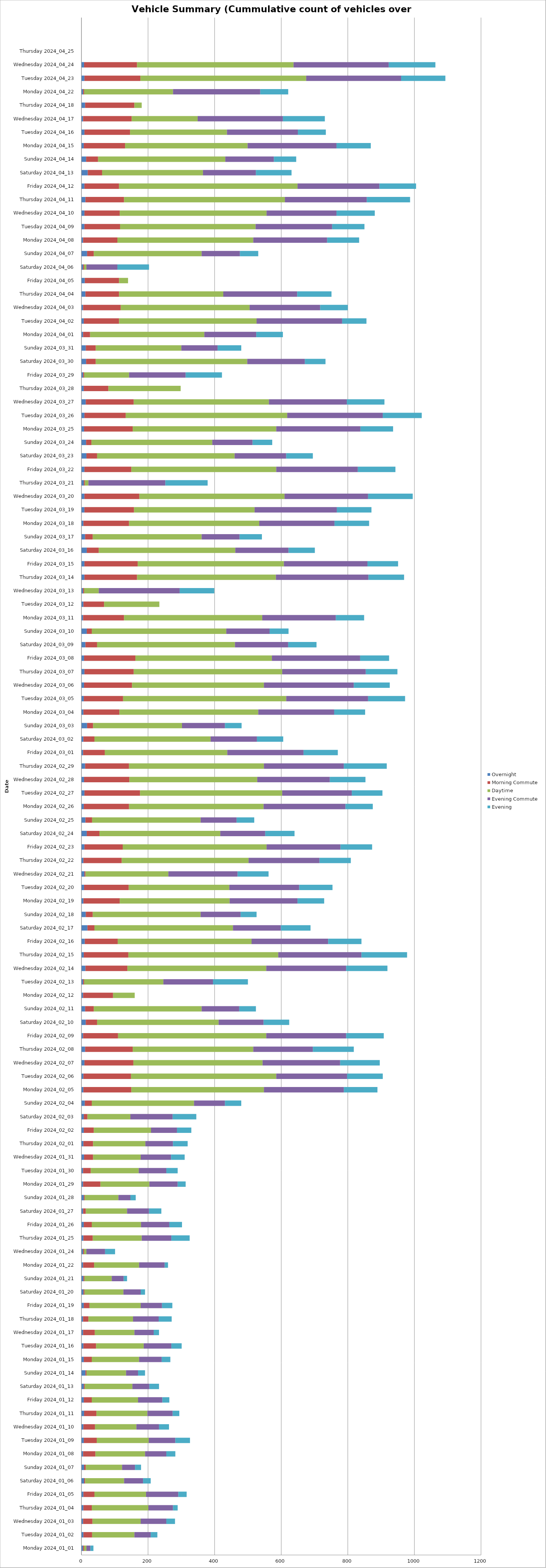
| Category | Overnight | Morning Commute | Daytime | Evening Commute | Evening |
|---|---|---|---|---|---|
| Monday 2024_01_01 | 5 | 3 | 7 | 12 | 9 |
| Tuesday 2024_01_02 | 6 | 26 | 127 | 49 | 20 |
| Wednesday 2024_01_03 | 5 | 28 | 145 | 77 | 26 |
| Thursday 2024_01_04 | 6 | 25 | 170 | 74 | 14 |
| Friday 2024_01_05 | 6 | 33 | 155 | 97 | 25 |
| Saturday 2024_01_06 | 8 | 3 | 117 | 57 | 23 |
| Sunday 2024_01_07 | 8 | 5 | 109 | 39 | 18 |
| Monday 2024_01_08 | 5 | 37 | 149 | 64 | 27 |
| Tuesday 2024_01_09 | 7 | 39 | 156 | 80 | 44 |
| Wednesday 2024_01_10 | 6 | 35 | 124 | 68 | 30 |
| Thursday 2024_01_11 | 8 | 37 | 153 | 76 | 20 |
| Friday 2024_01_12 | 7 | 24 | 139 | 73 | 21 |
| Saturday 2024_01_13 | 7 | 3 | 143 | 51 | 29 |
| Sunday 2024_01_14 | 12 | 3 | 119 | 36 | 21 |
| Monday 2024_01_15 | 7 | 24 | 142 | 68 | 26 |
| Tuesday 2024_01_16 | 6 | 38 | 143 | 83 | 31 |
| Wednesday 2024_01_17 | 5 | 35 | 119 | 58 | 16 |
| Thursday 2024_01_18 | 5 | 16 | 134 | 77 | 39 |
| Friday 2024_01_19 | 7 | 17 | 154 | 64 | 31 |
| Saturday 2024_01_20 | 6 | 3 | 117 | 52 | 13 |
| Sunday 2024_01_21 | 6 | 3 | 82 | 36 | 10 |
| Monday 2024_01_22 | 5 | 33 | 135 | 77 | 10 |
| Wednesday 2024_01_24 | 5 | 3 | 7 | 56 | 30 |
| Thursday 2024_01_25 | 6 | 28 | 147 | 89 | 55 |
| Friday 2024_01_26 | 7 | 24 | 148 | 85 | 38 |
| Saturday 2024_01_27 | 5 | 8 | 124 | 66 | 37 |
| Sunday 2024_01_28 | 7 | 3 | 101 | 36 | 16 |
| Monday 2024_01_29 | 5 | 52 | 147 | 85 | 24 |
| Tuesday 2024_01_30 | 5 | 23 | 144 | 83 | 34 |
| Wednesday 2024_01_31 | 8 | 27 | 143 | 91 | 41 |
| Thursday 2024_02_01 | 6 | 29 | 157 | 83 | 44 |
| Friday 2024_02_02 | 7 | 30 | 172 | 78 | 43 |
| Saturday 2024_02_03 | 7 | 11 | 129 | 127 | 71 |
| Sunday 2024_02_04 | 10 | 21 | 307 | 93 | 49 |
| Monday 2024_02_05 | 6 | 144 | 398 | 240 | 101 |
| Tuesday 2024_02_06 | 6 | 143 | 436 | 213 | 107 |
| Wednesday 2024_02_07 | 9 | 147 | 388 | 233 | 119 |
| Thursday 2024_02_08 | 11 | 143 | 362 | 179 | 123 |
| Friday 2024_02_09 | 5 | 105 | 445 | 240 | 113 |
| Saturday 2024_02_10 | 13 | 34 | 365 | 135 | 77 |
| Sunday 2024_02_11 | 11 | 26 | 324 | 113 | 50 |
| Monday 2024_02_12 | 5 | 90 | 65 | 0 | 0 |
| Tuesday 2024_02_13 | 5 | 3 | 238 | 149 | 105 |
| Wednesday 2024_02_14 | 12 | 126 | 417 | 240 | 124 |
| Thursday 2024_02_15 | 7 | 134 | 450 | 250 | 137 |
| Friday 2024_02_16 | 10 | 99 | 402 | 230 | 100 |
| Saturday 2024_02_17 | 18 | 21 | 416 | 144 | 89 |
| Sunday 2024_02_18 | 13 | 21 | 324 | 120 | 48 |
| Monday 2024_02_19 | 6 | 109 | 330 | 204 | 80 |
| Tuesday 2024_02_20 | 8 | 134 | 302 | 210 | 100 |
| Wednesday 2024_02_21 | 9 | 3 | 249 | 208 | 93 |
| Thursday 2024_02_22 | 6 | 115 | 381 | 213 | 94 |
| Friday 2024_02_23 | 9 | 115 | 432 | 222 | 95 |
| Saturday 2024_02_24 | 16 | 38 | 363 | 135 | 88 |
| Sunday 2024_02_25 | 12 | 20 | 326 | 108 | 53 |
| Monday 2024_02_26 | 7 | 136 | 404 | 246 | 82 |
| Tuesday 2024_02_27 | 9 | 167 | 427 | 209 | 92 |
| Wednesday 2024_02_28 | 8 | 136 | 384 | 218 | 107 |
| Thursday 2024_02_29 | 11 | 132 | 405 | 240 | 129 |
| Friday 2024_03_01 | 5 | 65 | 368 | 229 | 103 |
| Saturday 2024_03_02 | 6 | 33 | 349 | 139 | 79 |
| Sunday 2024_03_03 | 17 | 18 | 267 | 129 | 50 |
| Monday 2024_03_04 | 6 | 108 | 417 | 228 | 93 |
| Tuesday 2024_03_05 | 7 | 118 | 490 | 246 | 111 |
| Wednesday 2024_03_06 | 8 | 144 | 396 | 270 | 108 |
| Thursday 2024_03_07 | 9 | 148 | 446 | 251 | 95 |
| Friday 2024_03_08 | 8 | 154 | 410 | 265 | 87 |
| Saturday 2024_03_09 | 12 | 35 | 414 | 160 | 85 |
| Sunday 2024_03_10 | 16 | 15 | 404 | 130 | 57 |
| Monday 2024_03_11 | 5 | 123 | 415 | 221 | 85 |
| Tuesday 2024_03_12 | 6 | 62 | 166 | 0 | 0 |
| Wednesday 2024_03_13 | 5 | 3 | 44 | 243 | 104 |
| Thursday 2024_03_14 | 9 | 158 | 417 | 278 | 107 |
| Friday 2024_03_15 | 9 | 160 | 439 | 251 | 92 |
| Saturday 2024_03_16 | 16 | 36 | 410 | 160 | 79 |
| Sunday 2024_03_17 | 11 | 23 | 327 | 114 | 67 |
| Monday 2024_03_18 | 6 | 137 | 391 | 226 | 104 |
| Tuesday 2024_03_19 | 9 | 149 | 362 | 247 | 104 |
| Wednesday 2024_03_20 | 9 | 165 | 436 | 251 | 134 |
| Thursday 2024_03_21 | 7 | 3 | 11 | 231 | 127 |
| Friday 2024_03_22 | 9 | 141 | 435 | 245 | 113 |
| Saturday 2024_03_23 | 15 | 32 | 413 | 155 | 80 |
| Sunday 2024_03_24 | 14 | 16 | 363 | 121 | 59 |
| Monday 2024_03_25 | 8 | 146 | 431 | 253 | 98 |
| Tuesday 2024_03_26 | 9 | 124 | 485 | 287 | 117 |
| Wednesday 2024_03_27 | 13 | 144 | 406 | 234 | 113 |
| Thursday 2024_03_28 | 7 | 74 | 217 | 0 | 0 |
| Friday 2024_03_29 | 5 | 3 | 135 | 170 | 109 |
| Saturday 2024_03_30 | 14 | 29 | 455 | 173 | 62 |
| Sunday 2024_03_31 | 13 | 30 | 257 | 109 | 71 |
| Monday 2024_04_01 | 5 | 21 | 343 | 156 | 80 |
| Tuesday 2024_04_02 | 7 | 106 | 413 | 257 | 73 |
| Wednesday 2024_04_03 | 5 | 113 | 387 | 212 | 83 |
| Thursday 2024_04_04 | 12 | 101 | 313 | 222 | 103 |
| Friday 2024_04_05 | 10 | 103 | 27 | 0 | 0 |
| Saturday 2024_04_06 | 5 | 3 | 7 | 93 | 95 |
| Sunday 2024_04_07 | 17 | 20 | 324 | 115 | 55 |
| Monday 2024_04_08 | 5 | 103 | 408 | 222 | 96 |
| Tuesday 2024_04_09 | 9 | 107 | 407 | 230 | 97 |
| Wednesday 2024_04_10 | 9 | 106 | 441 | 210 | 115 |
| Thursday 2024_04_11 | 12 | 116 | 483 | 246 | 130 |
| Friday 2024_04_12 | 9 | 104 | 536 | 246 | 110 |
| Saturday 2024_04_13 | 19 | 43 | 303 | 159 | 107 |
| Sunday 2024_04_14 | 14 | 36 | 382 | 146 | 67 |
| Monday 2024_04_15 | 7 | 124 | 368 | 267 | 103 |
| Tuesday 2024_04_16 | 9 | 137 | 291 | 213 | 84 |
| Wednesday 2024_04_17 | 5 | 146 | 198 | 256 | 126 |
| Thursday 2024_04_18 | 11 | 148 | 22 | 0 | 0 |
| Monday 2024_04_22 | 5 | 3 | 267 | 262 | 84 |
| Tuesday 2024_04_23 | 9 | 168 | 498 | 285 | 133 |
| Wednesday 2024_04_24 | 8 | 159 | 470 | 286 | 140 |
| Thursday 2024_04_25 | 0 | 0 | 0 | 0 | 0 |